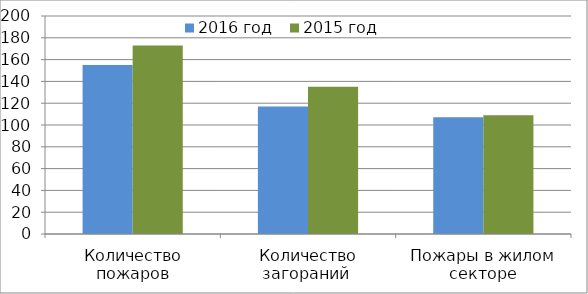
| Category | 2016 год | 2015 год |
|---|---|---|
| Количество пожаров | 155 | 173 |
| Количество загораний  | 117 | 135 |
| Пожары в жилом секторе | 107 | 109 |